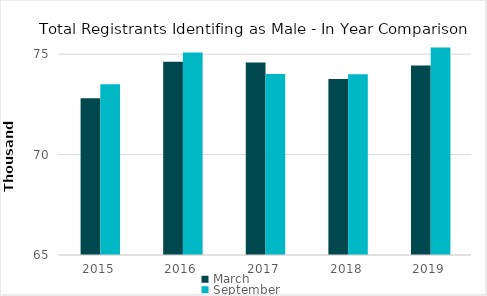
| Category | March | September |
|---|---|---|
| 2015-03-31 | 72803 | 73496 |
| 2016-03-31 | 74618 | 75089 |
| 2017-03-31 | 74581 | 74014 |
| 2018-03-31 | 73763 | 74006 |
| 2019-03-31 | 74431 | 75334 |